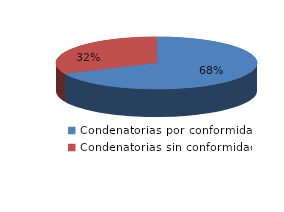
| Category | Series 0 |
|---|---|
| 0 | 1065 |
| 1 | 498 |